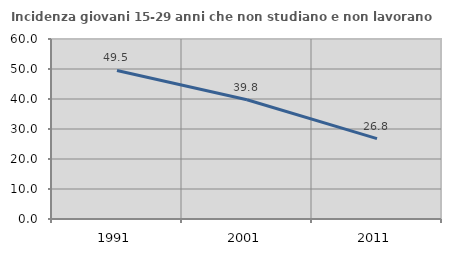
| Category | Incidenza giovani 15-29 anni che non studiano e non lavorano  |
|---|---|
| 1991.0 | 49.515 |
| 2001.0 | 39.75 |
| 2011.0 | 26.772 |